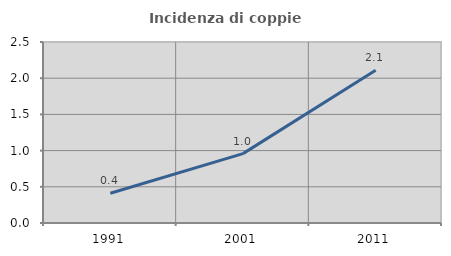
| Category | Incidenza di coppie miste |
|---|---|
| 1991.0 | 0.411 |
| 2001.0 | 0.958 |
| 2011.0 | 2.109 |